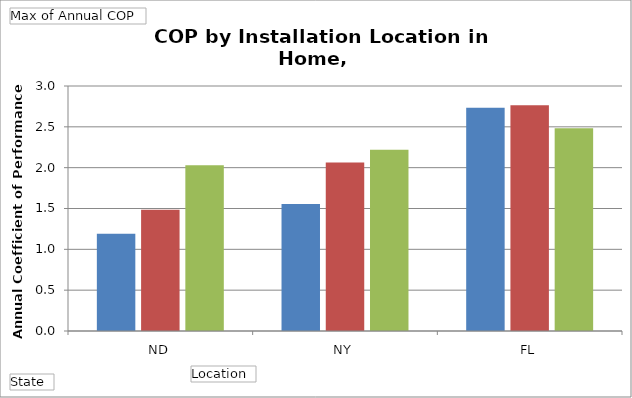
| Category | Vented closet | Garage | Basement |
|---|---|---|---|
| ND | 1.19 | 1.486 | 2.029 |
| NY | 1.556 | 2.065 | 2.219 |
| FL | 2.733 | 2.765 | 2.483 |